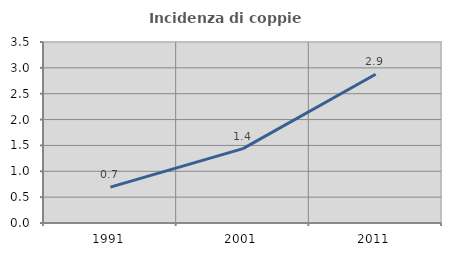
| Category | Incidenza di coppie miste |
|---|---|
| 1991.0 | 0.693 |
| 2001.0 | 1.438 |
| 2011.0 | 2.876 |